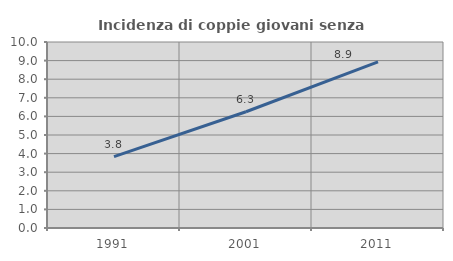
| Category | Incidenza di coppie giovani senza figli |
|---|---|
| 1991.0 | 3.834 |
| 2001.0 | 6.25 |
| 2011.0 | 8.935 |